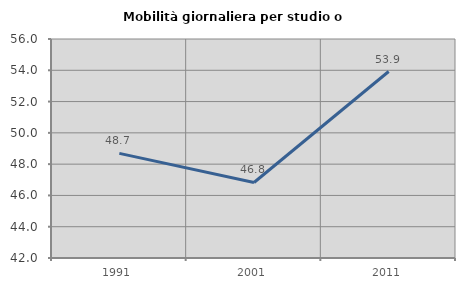
| Category | Mobilità giornaliera per studio o lavoro |
|---|---|
| 1991.0 | 48.69 |
| 2001.0 | 46.828 |
| 2011.0 | 53.922 |